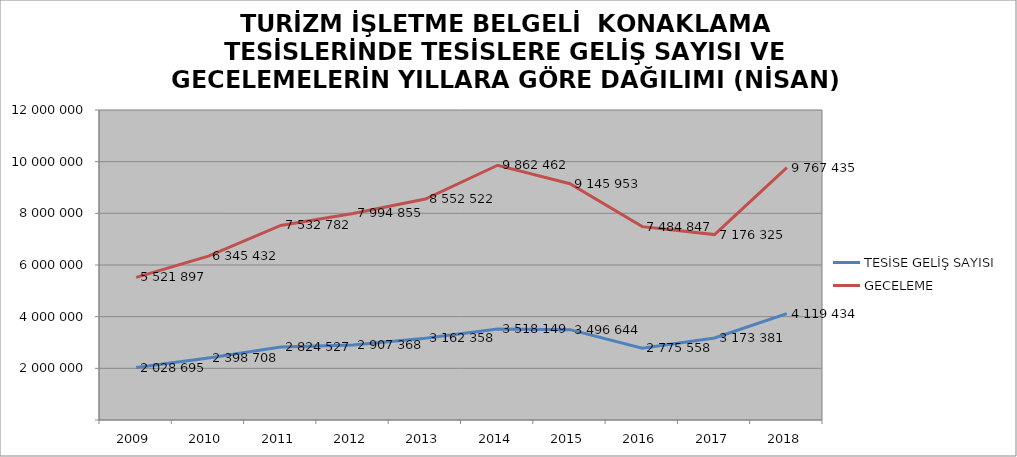
| Category | TESİSE GELİŞ SAYISI | GECELEME |
|---|---|---|
| 2009 | 2028695 | 5521897 |
| 2010 | 2398708 | 6345432 |
| 2011 | 2824527 | 7532782 |
| 2012 | 2907368 | 7994855 |
| 2013 | 3162358 | 8552522 |
| 2014 | 3518149 | 9862462 |
| 2015 | 3496644 | 9145953 |
| 2016 | 2775558 | 7484847 |
| 2017 | 3173381 | 7176325 |
| 2018 | 4119434 | 9767435 |